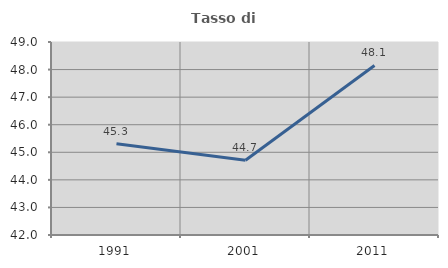
| Category | Tasso di occupazione   |
|---|---|
| 1991.0 | 45.311 |
| 2001.0 | 44.711 |
| 2011.0 | 48.149 |